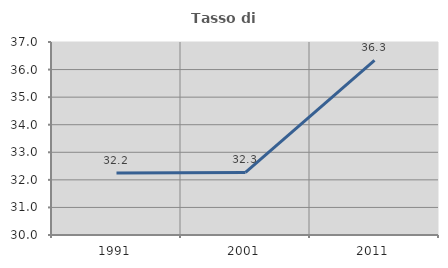
| Category | Tasso di occupazione   |
|---|---|
| 1991.0 | 32.248 |
| 2001.0 | 32.27 |
| 2011.0 | 36.33 |